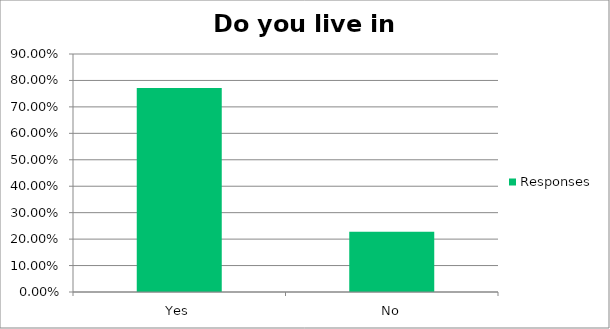
| Category | Responses |
|---|---|
| Yes | 0.772 |
| No | 0.228 |